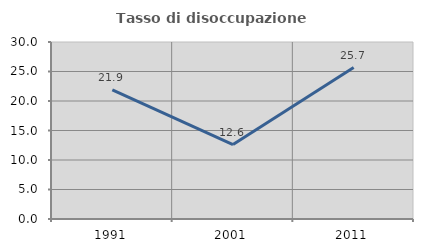
| Category | Tasso di disoccupazione giovanile  |
|---|---|
| 1991.0 | 21.869 |
| 2001.0 | 12.621 |
| 2011.0 | 25.66 |